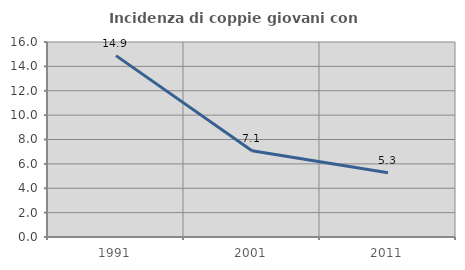
| Category | Incidenza di coppie giovani con figli |
|---|---|
| 1991.0 | 14.881 |
| 2001.0 | 7.084 |
| 2011.0 | 5.263 |